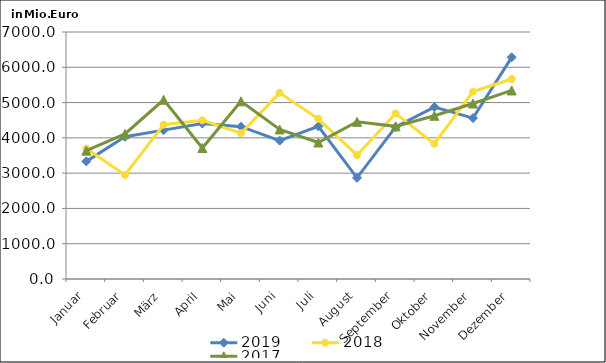
| Category | 2019 | 2018 | 2017 |
|---|---|---|---|
| Januar | 3333.94 | 3697.342 | 3636.266 |
| Februar | 4030.16 | 2948.215 | 4110.187 |
| März | 4218.677 | 4373.645 | 5079.358 |
| April | 4405.267 | 4496.151 | 3712.319 |
| Mai | 4316.5 | 4130.497 | 5035.086 |
| Juni | 3921.711 | 5275.525 | 4237.826 |
| Juli | 4327.093 | 4538.362 | 3867.272 |
| August | 2868.236 | 3508.574 | 4455.126 |
| September | 4308.925 | 4692.822 | 4325.752 |
| Oktober | 4872.617 | 3831.402 | 4626.133 |
| November | 4559.664 | 5309.883 | 4974.047 |
| Dezember | 6282.192 | 5667.204 | 5343.445 |